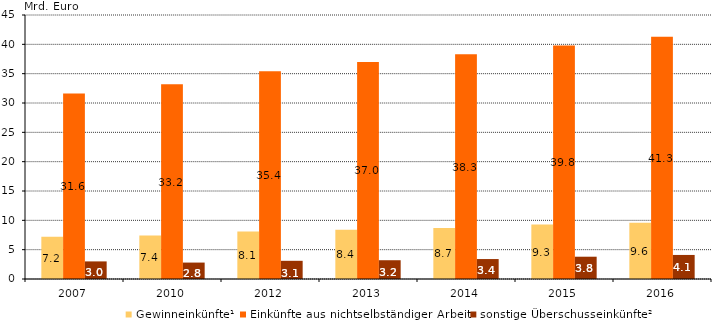
| Category | Gewinneinkünfte¹ | Einkünfte aus nichtselbständiger Arbeit | sonstige Überschusseinkünfte² |
|---|---|---|---|
| 2007.0 | 7.2 | 31.6 | 3 |
| 2010.0 | 7.4 | 33.2 | 2.8 |
| 2012.0 | 8.1 | 35.4 | 3.1 |
| 2013.0 | 8.4 | 37 | 3.2 |
| 2014.0 | 8.7 | 38.3 | 3.4 |
| 2015.0 | 9.3 | 39.8 | 3.8 |
| 2016.0 | 9.6 | 41.3 | 4.1 |